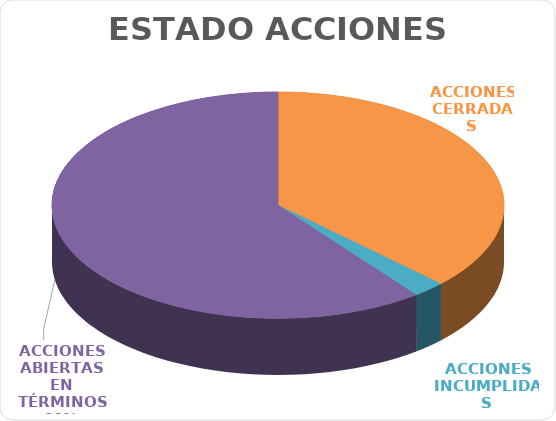
| Category | Series 0 |
|---|---|
| ACCIONES CERRADAS | 32 |
| ACCIONES INCUMPLIDAS | 2 |
| ACCIONES ABIERTAS EN TÉRMINOS | 52 |